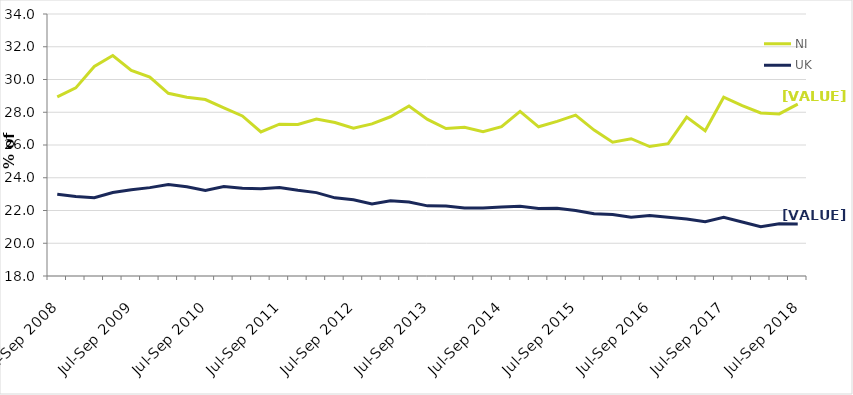
| Category | NI | UK |
|---|---|---|
| Jul-Sep 2008 | 28.937 | 22.996 |
| Oct-Dec 2008 | 29.489 | 22.851 |
| Jan-Mar 2009 | 30.792 | 22.786 |
| Apr-Jun 2009 | 31.467 | 23.097 |
| Jul-Sep 2009 | 30.556 | 23.27 |
| Oct-Dec 2009 | 30.141 | 23.397 |
| Jan-Mar 2010 | 29.156 | 23.588 |
| Apr-Jun 2010 | 28.921 | 23.451 |
| Jul-Sep 2010 | 28.774 | 23.219 |
| Oct-Dec 2010 | 28.271 | 23.468 |
| Jan-Mar 2011 | 27.775 | 23.36 |
| Apr-Jun 2011 | 26.796 | 23.329 |
| Jul-Sep 2011 | 27.274 | 23.402 |
| Oct-Dec 2011 | 27.25 | 23.233 |
| Jan-Mar 2012 | 27.586 | 23.091 |
| Apr-Jun 2012 | 27.377 | 22.772 |
| Jul-Sep 2012 | 27.027 | 22.654 |
| Oct-Dec 2012 | 27.29 | 22.399 |
| Jan-Mar 2013 | 27.724 | 22.591 |
| Apr-Jun 2013 | 28.384 | 22.524 |
| Jul-Sep 2013 | 27.56 | 22.283 |
| Oct-Dec 2013 | 27.003 | 22.276 |
| Jan-Mar 2014 | 27.078 | 22.149 |
| Apr-Jun 2014 | 26.812 | 22.156 |
| Jul-Sep 2014 | 27.121 | 22.206 |
| Oct-Dec 2014 | 28.053 | 22.253 |
| Jan-Mar 2015 | 27.111 | 22.118 |
| Apr-Jun 2015 | 27.442 | 22.136 |
| Jul-Sep 2015 | 27.82 | 22.003 |
| Oct-Dec 2015 | 26.909 | 21.8 |
| Jan-Mar 2016 | 26.171 | 21.755 |
| Apr-Jun 2016 | 26.384 | 21.596 |
| Jul-Sep 2016 | 25.907 | 21.693 |
| Oct-Dec 2016 | 26.081 | 21.593 |
| Jan-Mar 2017 | 27.701 | 21.48 |
| Apr-Jun 2017 | 26.871 | 21.309 |
| Jul-Sep 2017 | 28.916 | 21.58 |
| Oct-Dec 2017 | 28.406 | 21.302 |
| Jan-Mar 2018 | 27.959 | 21.01 |
| Apr-Jun 2018 | 27.898 | 21.184 |
| Jul-Sep 2018 | 28.494 | 21.176 |